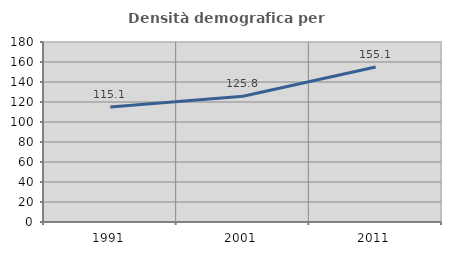
| Category | Densità demografica |
|---|---|
| 1991.0 | 115.106 |
| 2001.0 | 125.78 |
| 2011.0 | 155.069 |